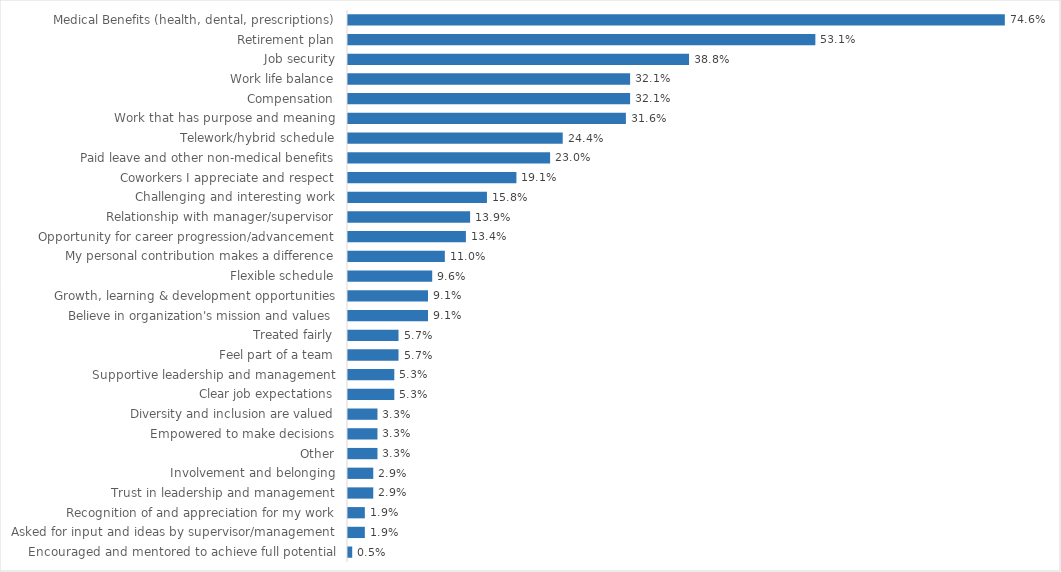
| Category | Labor |
|---|---|
| Medical Benefits (health, dental, prescriptions) | 0.746 |
| Retirement plan | 0.531 |
| Job security | 0.388 |
| Work life balance | 0.321 |
| Compensation | 0.321 |
| Work that has purpose and meaning | 0.316 |
| Telework/hybrid schedule | 0.244 |
| Paid leave and other non-medical benefits | 0.23 |
| Coworkers I appreciate and respect | 0.191 |
| Challenging and interesting work | 0.158 |
| Relationship with manager/supervisor | 0.139 |
| Opportunity for career progression/advancement | 0.134 |
| My personal contribution makes a difference | 0.11 |
| Flexible schedule | 0.096 |
| Growth, learning & development opportunities | 0.091 |
| Believe in organization's mission and values | 0.091 |
| Treated fairly | 0.057 |
| Feel part of a team | 0.057 |
| Supportive leadership and management | 0.053 |
| Clear job expectations | 0.053 |
| Diversity and inclusion are valued | 0.033 |
| Empowered to make decisions | 0.033 |
| Other | 0.033 |
| Involvement and belonging | 0.029 |
| Trust in leadership and management | 0.029 |
| Recognition of and appreciation for my work | 0.019 |
| Asked for input and ideas by supervisor/management | 0.019 |
| Encouraged and mentored to achieve full potential | 0.005 |